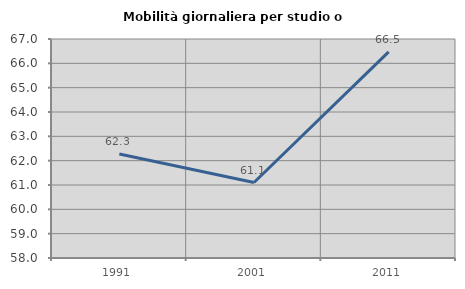
| Category | Mobilità giornaliera per studio o lavoro |
|---|---|
| 1991.0 | 62.277 |
| 2001.0 | 61.102 |
| 2011.0 | 66.47 |